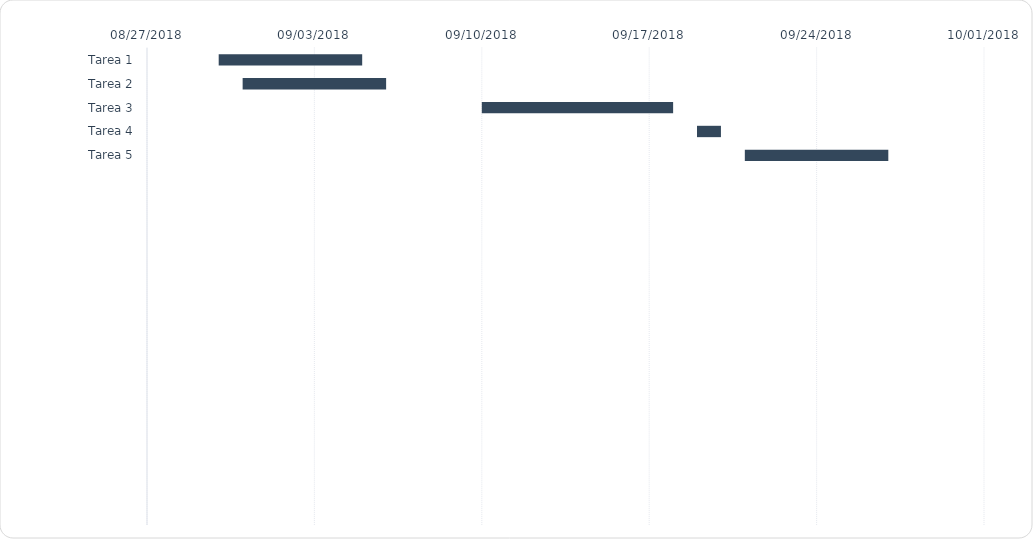
| Category | Fecha de inicio | Days Complete (for chart) | Days Remaining (for chart) |
|---|---|---|---|
| Tarea 1 | 8/30/18 | 6 | 0 |
| Tarea 2 | 8/31/18 | 6 | 0 |
| Tarea 3 | 9/10/18 | 8 | 0 |
| Tarea 4 | 9/19/18 | 1 | 0 |
| Tarea 5 | 9/21/18 | 6 | 0 |